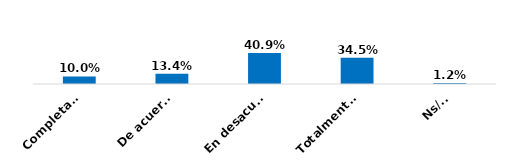
| Category | Series 0 |
|---|---|
| Completamente de acuerdo | 0.1 |
| De acuerdo | 0.134 |
| En desacuerdo | 0.409 |
| Totalmente en desacuerdo | 0.345 |
| Ns/Nr | 0.012 |